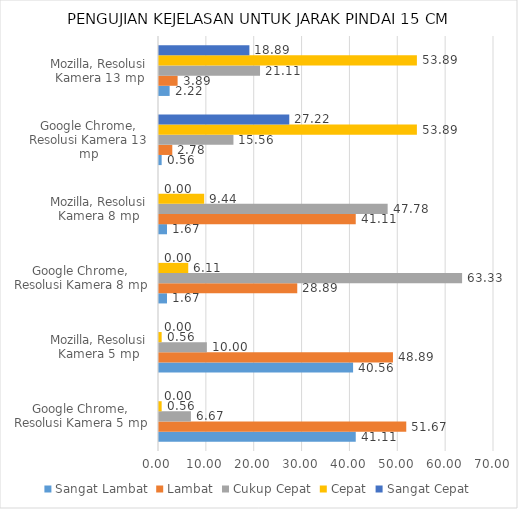
| Category | Sangat Lambat | Lambat | Cukup Cepat | Cepat | Sangat Cepat |
|---|---|---|---|---|---|
| Google Chrome, Resolusi Kamera 5 mp | 41.111 | 51.667 | 6.667 | 0.556 | 0 |
| Mozilla, Resolusi Kamera 5 mp | 40.556 | 48.889 | 10 | 0.556 | 0 |
| Google Chrome, Resolusi Kamera 8 mp | 1.667 | 28.889 | 63.333 | 6.111 | 0 |
| Mozilla, Resolusi Kamera 8 mp | 1.667 | 41.111 | 47.778 | 9.444 | 0 |
| Google Chrome, Resolusi Kamera 13 mp | 0.556 | 2.778 | 15.556 | 53.889 | 27.222 |
| Mozilla, Resolusi Kamera 13 mp | 2.222 | 3.889 | 21.111 | 53.889 | 18.889 |